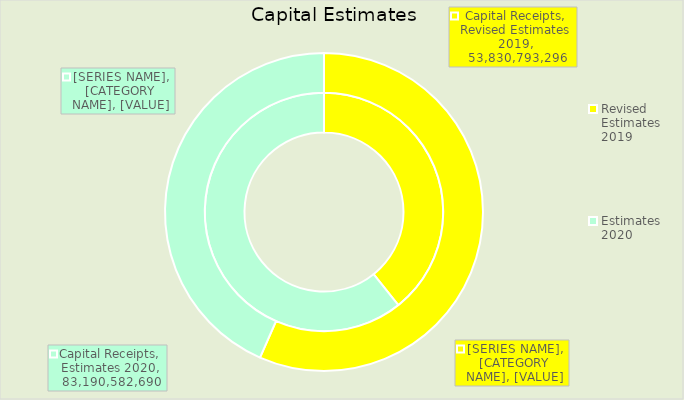
| Category | Capital Receipts | Transfer from Revenue Surplus |
|---|---|---|
| Revised Estimates 2019 | 53830793296 | 18205483673 |
| Estimates 2020 | 83190582690.498 | 13963380503.503 |